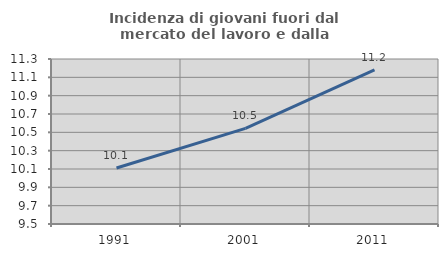
| Category | Incidenza di giovani fuori dal mercato del lavoro e dalla formazione  |
|---|---|
| 1991.0 | 10.111 |
| 2001.0 | 10.543 |
| 2011.0 | 11.181 |